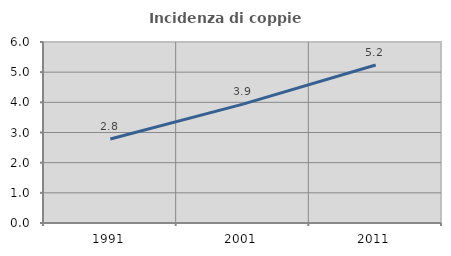
| Category | Incidenza di coppie miste |
|---|---|
| 1991.0 | 2.786 |
| 2001.0 | 3.939 |
| 2011.0 | 5.236 |